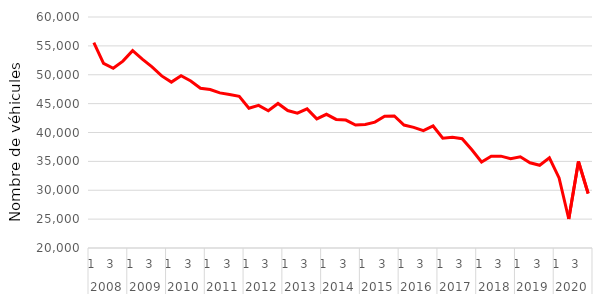
| Category | Série CVS-CJO |
|---|---|
| 0 | 55553.135 |
| 1 | 51965.056 |
| 2 | 51120.948 |
| 3 | 52358.15 |
| 4 | 54176.515 |
| 5 | 52704.966 |
| 6 | 51360.481 |
| 7 | 49801.347 |
| 8 | 48725.061 |
| 9 | 49839.768 |
| 10 | 48927.926 |
| 11 | 47666.74 |
| 12 | 47442.442 |
| 13 | 46858.638 |
| 14 | 46562.956 |
| 15 | 46263.401 |
| 16 | 44203.973 |
| 17 | 44690.986 |
| 18 | 43763.755 |
| 19 | 45025.91 |
| 20 | 43796.966 |
| 21 | 43360.505 |
| 22 | 44086.31 |
| 23 | 42352.248 |
| 24 | 43151.331 |
| 25 | 42259.892 |
| 26 | 42151.917 |
| 27 | 41284.31 |
| 28 | 41402.367 |
| 29 | 41802.367 |
| 30 | 42815.369 |
| 31 | 42852.718 |
| 32 | 41285.229 |
| 33 | 40885.544 |
| 34 | 40319.269 |
| 35 | 41129.061 |
| 36 | 39010.465 |
| 37 | 39173.864 |
| 38 | 38934.839 |
| 39 | 37007.754 |
| 40 | 34899.815 |
| 41 | 35874.045 |
| 42 | 35908.141 |
| 43 | 35465.703 |
| 44 | 35796.032 |
| 45 | 34755.145 |
| 46 | 34326.431 |
| 47 | 35601.873 |
| 48 | 32140.318 |
| 49 | 25020.469 |
| 50 | 34968.767 |
| 51 | 29438.032 |